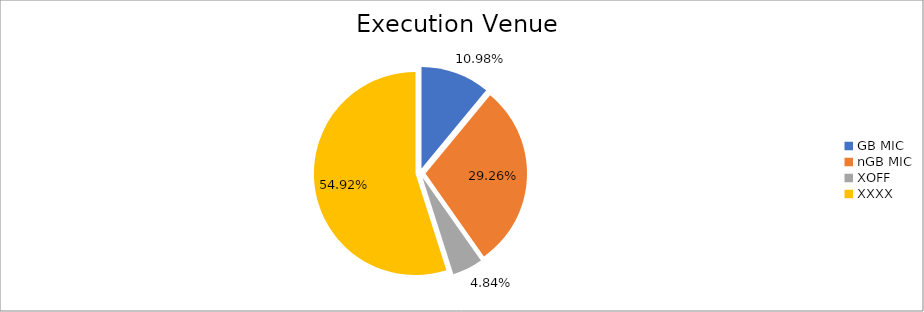
| Category | Series 0 |
|---|---|
| GB MIC | 1037274.756 |
| nGB MIC | 2763094.98 |
| XOFF | 457047.006 |
| XXXX | 5187240.823 |